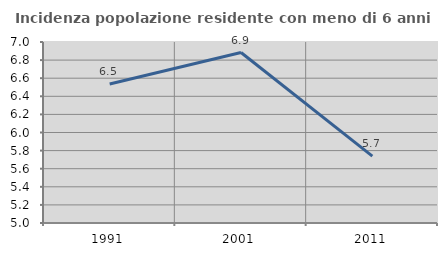
| Category | Incidenza popolazione residente con meno di 6 anni |
|---|---|
| 1991.0 | 6.535 |
| 2001.0 | 6.884 |
| 2011.0 | 5.739 |